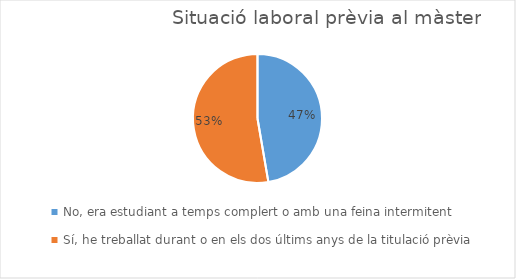
| Category | Series 0 |
|---|---|
| No, era estudiant a temps complert o amb una feina intermitent
 | 35 |
| Sí, he treballat durant o en els dos últims anys de la titulació prèvia | 39 |